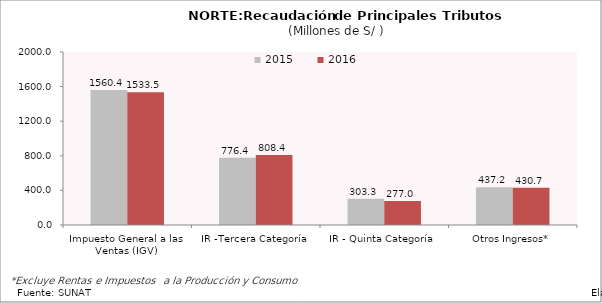
| Category | 2015 | 2016 |
|---|---|---|
| Impuesto General a las Ventas (IGV) | 1560.436 | 1533.497 |
| IR -Tercera Categoría | 776.449 | 808.389 |
| IR - Quinta Categoría | 303.279 | 277 |
| Otros Ingresos* | 437.159 | 430.689 |